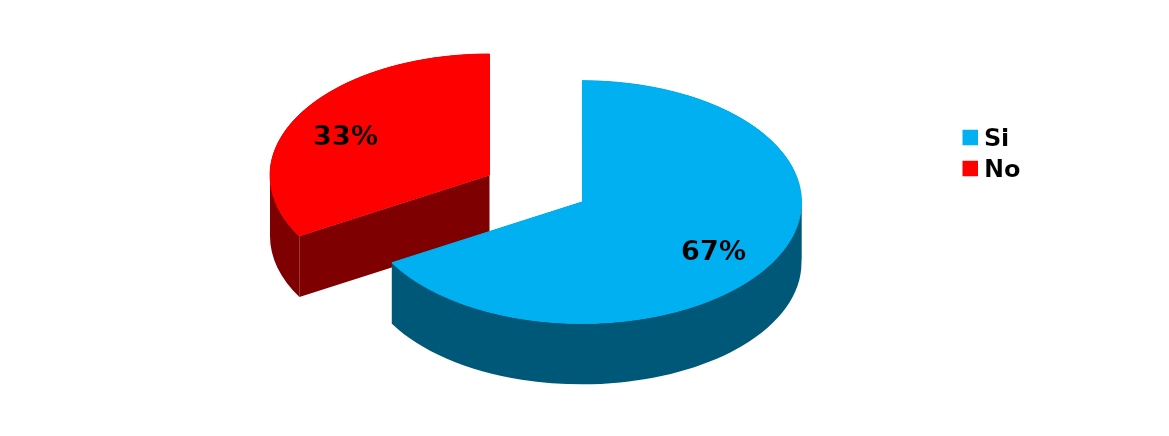
| Category | Series 0 |
|---|---|
| Si | 48 |
| No | 24 |